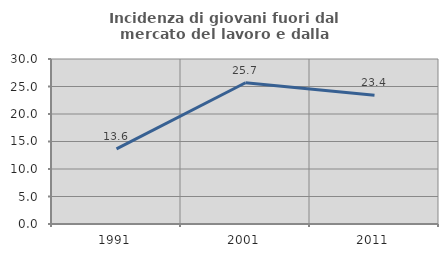
| Category | Incidenza di giovani fuori dal mercato del lavoro e dalla formazione  |
|---|---|
| 1991.0 | 13.644 |
| 2001.0 | 25.676 |
| 2011.0 | 23.43 |